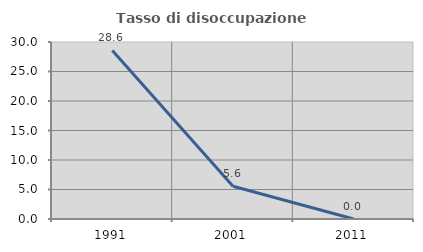
| Category | Tasso di disoccupazione giovanile  |
|---|---|
| 1991.0 | 28.571 |
| 2001.0 | 5.556 |
| 2011.0 | 0 |